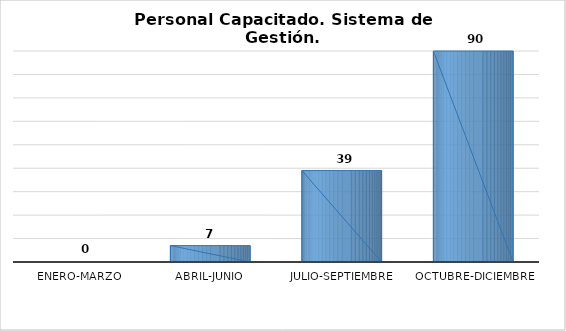
| Category | Personal capacitado/2 |
|---|---|
| Enero-Marzo | 0 |
| Abril-Junio | 7 |
| Julio-Septiembre | 39 |
| Octubre-Diciembre | 90 |